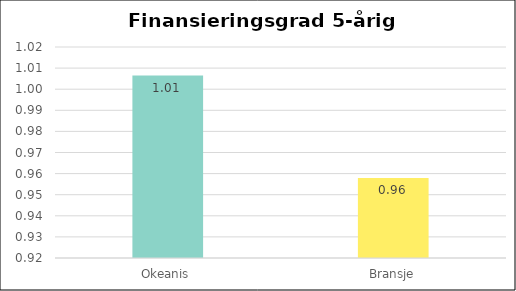
| Category | Series 0 |
|---|---|
| Okeanis | 1.006 |
| Bransje | 0.958 |